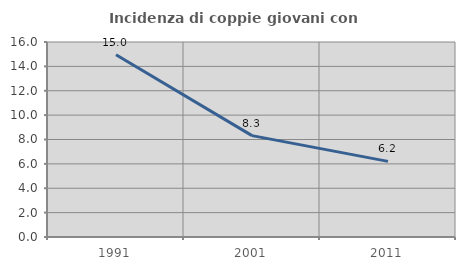
| Category | Incidenza di coppie giovani con figli |
|---|---|
| 1991.0 | 14.953 |
| 2001.0 | 8.318 |
| 2011.0 | 6.207 |